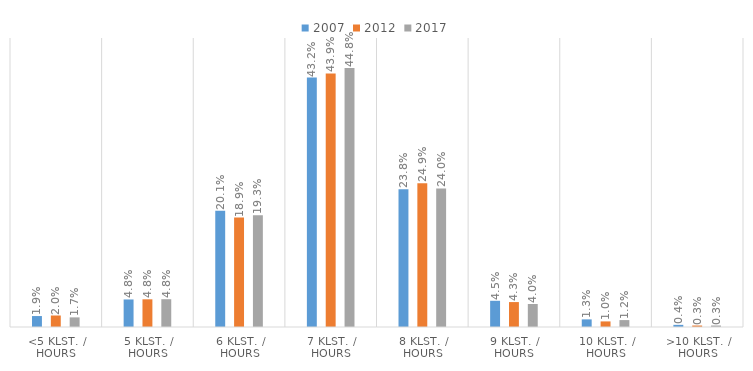
| Category | 2007 | 2012 | 2017 |
|---|---|---|---|
| <5 klst. / hours | 0.019 | 0.02 | 0.017 |
| 5 klst. / hours | 0.048 | 0.048 | 0.048 |
| 6 klst. / hours | 0.201 | 0.189 | 0.193 |
| 7 klst. / hours | 0.432 | 0.439 | 0.448 |
| 8 klst. / hours | 0.238 | 0.249 | 0.24 |
| 9 klst. / hours | 0.045 | 0.043 | 0.04 |
| 10 klst. / hours | 0.013 | 0.01 | 0.012 |
| >10 klst. / hours | 0.004 | 0.003 | 0.003 |